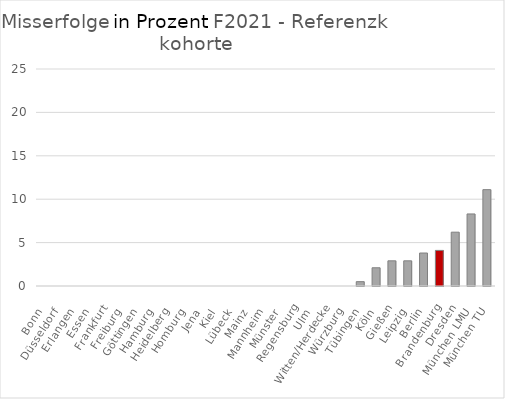
| Category | Misserfolg Ref |
|---|---|
| Bonn | 0 |
| Düsseldorf | 0 |
| Erlangen | 0 |
| Essen | 0 |
| Frankfurt | 0 |
| Freiburg | 0 |
| Göttingen | 0 |
| Hamburg | 0 |
| Heidelberg | 0 |
| Homburg | 0 |
| Jena | 0 |
| Kiel | 0 |
| Lübeck | 0 |
| Mainz | 0 |
| Mannheim | 0 |
| Münster | 0 |
| Regensburg | 0 |
| Ulm | 0 |
| Witten/Herdecke | 0 |
| Würzburg | 0 |
| Tübingen | 0.5 |
| Köln | 2.1 |
| Gießen | 2.9 |
| Leipzig | 2.9 |
| Berlin | 3.8 |
| Brandenburg | 4.1 |
| Dresden | 6.2 |
| München LMU | 8.3 |
| München TU | 11.1 |